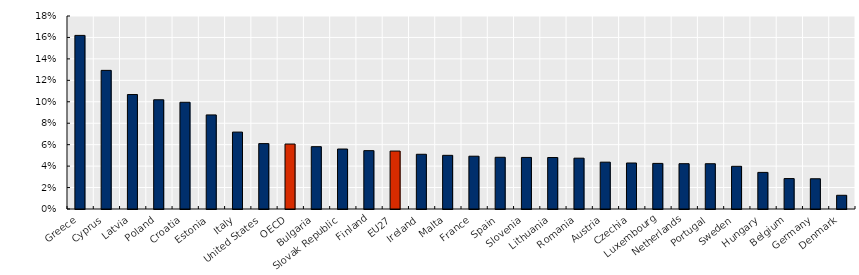
| Category | Share of respondents who responded "yes" |
|---|---|
| Greece | 0.162 |
| Cyprus | 0.129 |
| Latvia | 0.107 |
| Poland | 0.102 |
| Croatia | 0.1 |
| Estonia | 0.088 |
| Italy | 0.072 |
| United States | 0.061 |
| OECD | 0.061 |
| Bulgaria | 0.058 |
| Slovak Republic | 0.056 |
| Finland | 0.054 |
| EU27 | 0.054 |
| Ireland | 0.051 |
| Malta | 0.05 |
| France | 0.049 |
| Spain | 0.048 |
| Slovenia | 0.048 |
| Lithuania | 0.048 |
| Romania | 0.047 |
| Austria | 0.044 |
| Czechia | 0.043 |
| Luxembourg | 0.043 |
| Netherlands | 0.042 |
| Portugal | 0.042 |
| Sweden | 0.04 |
| Hungary | 0.034 |
| Belgium | 0.028 |
| Germany | 0.028 |
| Denmark | 0.013 |